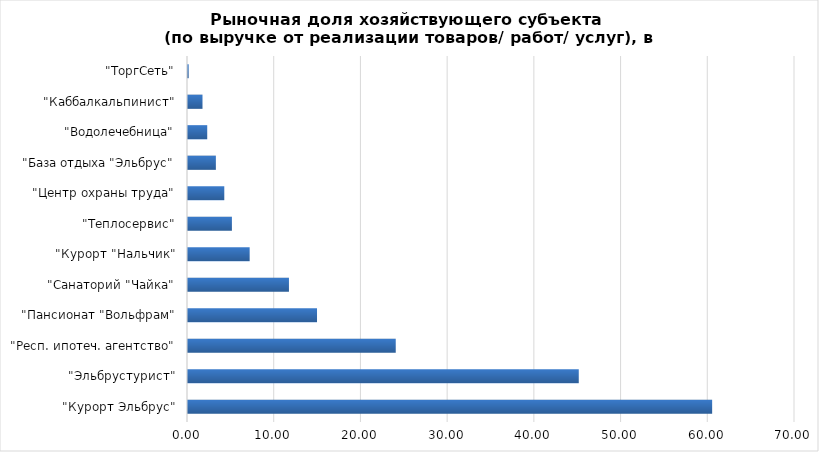
| Category | Рыночная доля хозяйствующего субъекта (по выручке от реализации товаров/ работ/ услуг), в процентах |
|---|---|
| "Курорт Эльбрус" | 60.446 |
| "Эльбрустурист" | 45.063 |
| "Респ. ипотеч. агентство" | 23.957 |
| "Пансионат "Вольфрам" | 14.878 |
| "Санаторий "Чайка" | 11.641 |
| "Курорт "Нальчик" | 7.111 |
| "Теплосервис" | 5.063 |
| "Центр охраны труда" | 4.185 |
| "База отдыха "Эльбрус" | 3.214 |
| "Водолечебница" | 2.218 |
| "Каббалкальпинист" | 1.672 |
| "ТоргСеть" | 0.079 |